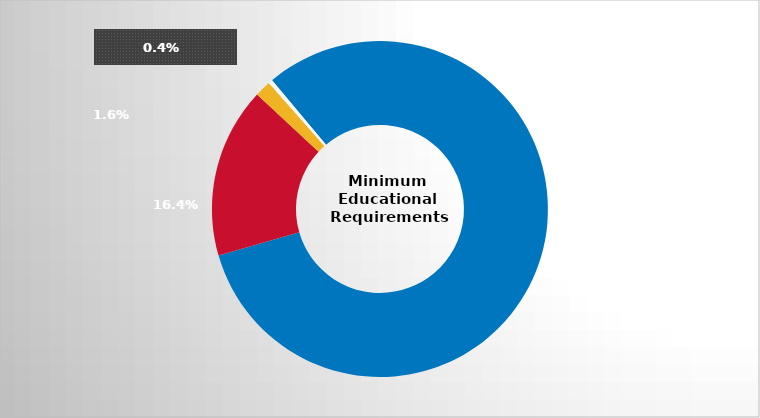
| Category | Series 0 |
|---|---|
| GED/High school diploma | 0.816 |
| Less than 1 year of college | 0.164 |
| 1 year of college | 0.016 |
| Other | 0.004 |